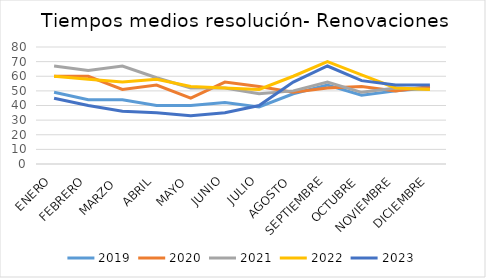
| Category | 2019 | 2020 | 2021 | 2022 | 2023 |
|---|---|---|---|---|---|
| ENERO | 49 | 60 | 67 | 60 | 45 |
| FEBRERO | 44 | 60 | 64 | 58 | 40 |
| MARZO  | 44 | 51 | 67 | 56 | 36 |
| ABRIL | 40 | 54 | 59 | 58 | 35 |
| MAYO | 40 | 45 | 52 | 53 | 33 |
| JUNIO | 42 | 56 | 52 | 52 | 35 |
| JULIO | 39 | 53 | 48 | 51 | 40 |
| AGOSTO | 48 | 49 | 50 | 60 | 56 |
| SEPTIEMBRE | 54 | 52 | 56 | 70 | 67 |
| OCTUBRE | 47 | 53 | 49 | 61 | 57 |
| NOVIEMBRE | 50 | 50 | 52 | 52 | 54 |
| DICIEMBRE | 52 | 53 | 51 | 51 | 54 |